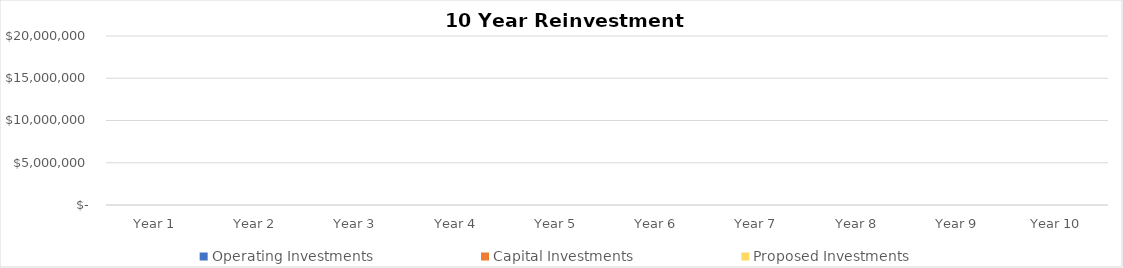
| Category | Operating Investments | Capital Investments |
|---|---|---|
| Year 1 | 0 | 0 |
| Year 2 | 0 | 0 |
| Year 3 | 0 | 0 |
| Year 4 | 0 | 0 |
| Year 5 | 0 | 0 |
| Year 6 | 0 | 0 |
| Year 7 | 0 | 0 |
| Year 8 | 0 | 0 |
| Year 9 | 0 | 0 |
| Year 10 | 0 | 0 |